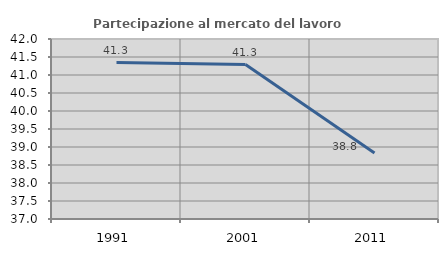
| Category | Partecipazione al mercato del lavoro  femminile |
|---|---|
| 1991.0 | 41.346 |
| 2001.0 | 41.29 |
| 2011.0 | 38.831 |